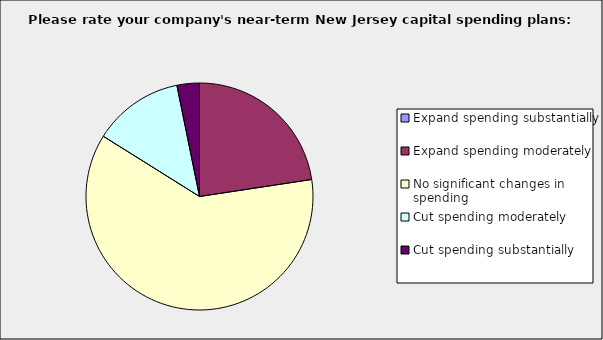
| Category | Series 0 |
|---|---|
| Expand spending substantially | 0 |
| Expand spending moderately | 0.226 |
| No significant changes in spending | 0.613 |
| Cut spending moderately | 0.129 |
| Cut spending substantially | 0.032 |